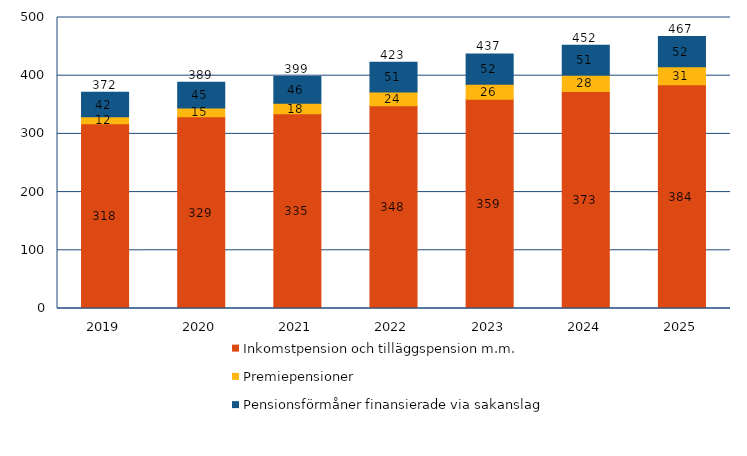
| Category | Inkomstpension och tilläggspension m.m. | Premiepensioner | Pensionsförmåner finansierade via sakanslag | Series 3 |
|---|---|---|---|---|
| 2019.0 | 317.628 | 11.715 | 42.22 | 371.563 |
| 2020.0 | 329.365 | 15.016 | 44.546 | 388.927 |
| 2021.0 | 334.629 | 17.837 | 46.326 | 398.792 |
| 2022.0 | 348.18 | 23.669 | 51.21 | 423.059 |
| 2023.0 | 359.336 | 25.953 | 52.094 | 437.383 |
| 2024.0 | 372.742 | 28.151 | 51.285 | 452.178 |
| 2025.0 | 384.376 | 30.925 | 51.899 | 467.2 |